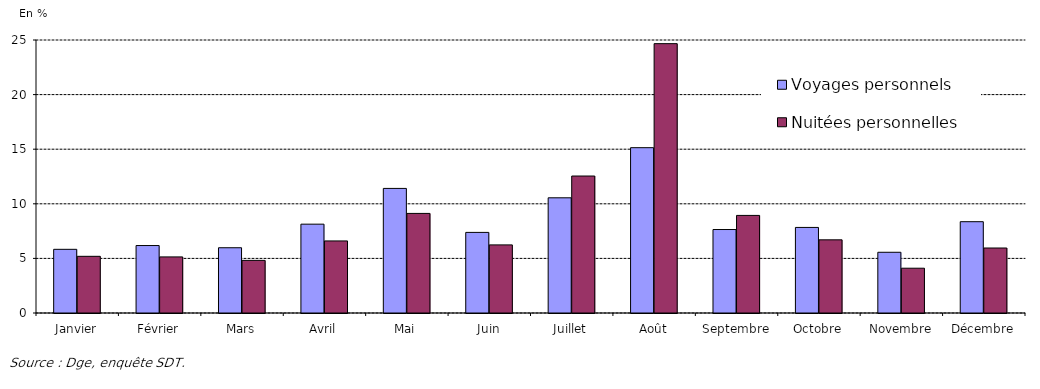
| Category | Voyages personnels | Nuitées personnelles |
|---|---|---|
| Janvier | 5.831 | 5.19 |
| Février | 6.178 | 5.138 |
| Mars | 5.975 | 4.818 |
| Avril | 8.135 | 6.6 |
| Mai | 11.409 | 9.119 |
| Juin | 7.381 | 6.238 |
| Juillet | 10.55 | 12.543 |
| Août | 15.139 | 24.666 |
| Septembre | 7.644 | 8.936 |
| Octobre | 7.837 | 6.699 |
| Novembre | 5.561 | 4.101 |
| Décembre | 8.361 | 5.951 |